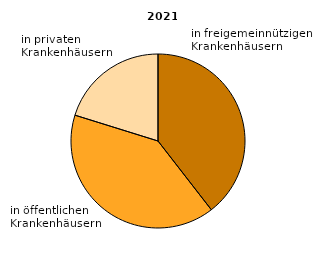
| Category | Series 0 |
|---|---|
| 0 | 39.5 |
| 1 | 40.3 |
| 2 | 20.2 |